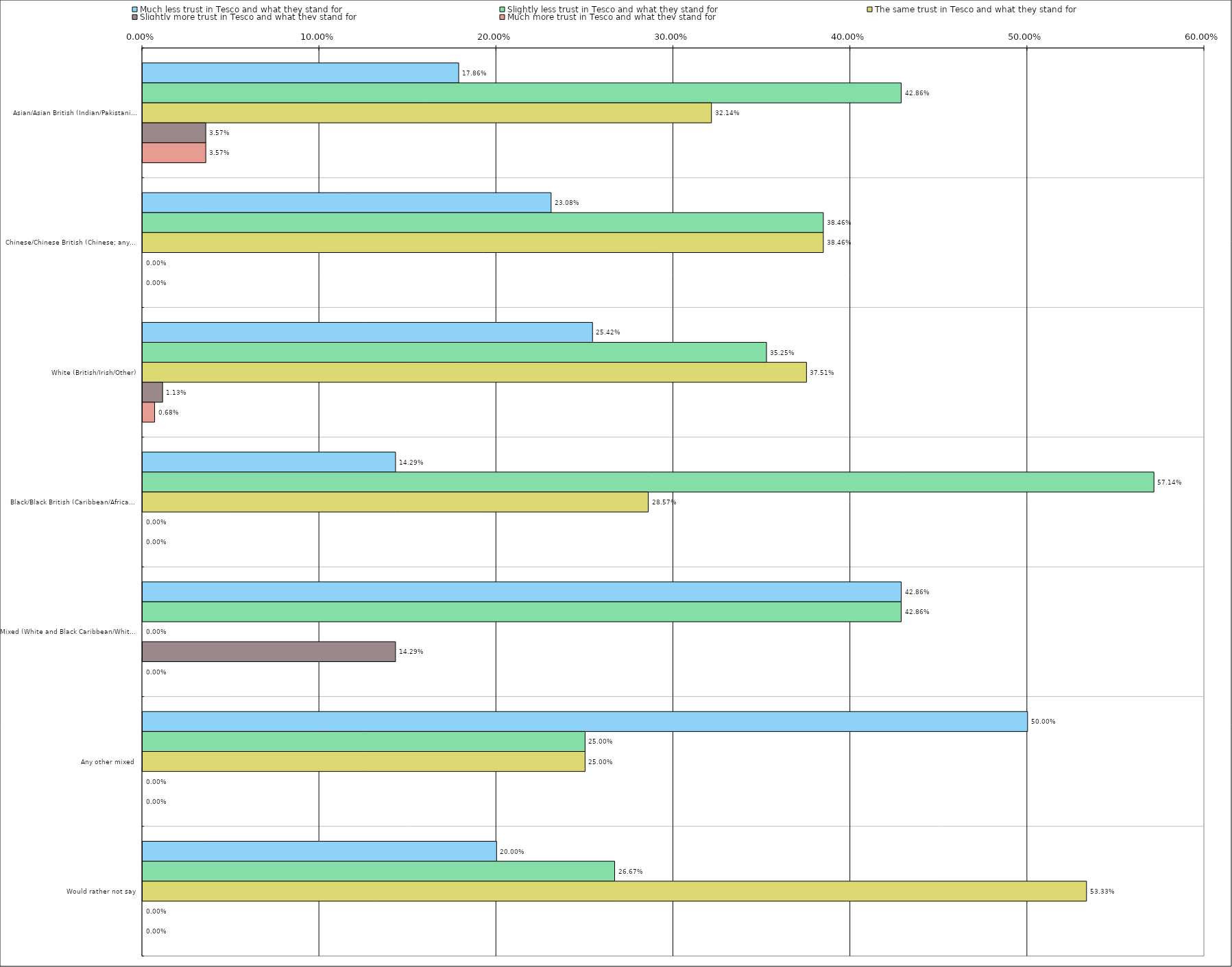
| Category | Much less trust in Tesco and what they stand for | Slightly less trust in Tesco and what they stand for | The same trust in Tesco and what they stand for | Slightly more trust in Tesco and what they stand for | Much more trust in Tesco and what they stand for |
|---|---|---|---|---|---|
| 0 | 0.179 | 0.429 | 0.321 | 0.036 | 0.036 |
| 1 | 0.231 | 0.385 | 0.385 | 0 | 0 |
| 2 | 0.254 | 0.352 | 0.375 | 0.011 | 0.007 |
| 3 | 0.143 | 0.571 | 0.286 | 0 | 0 |
| 4 | 0.429 | 0.429 | 0 | 0.143 | 0 |
| 5 | 0.5 | 0.25 | 0.25 | 0 | 0 |
| 6 | 0.2 | 0.267 | 0.533 | 0 | 0 |